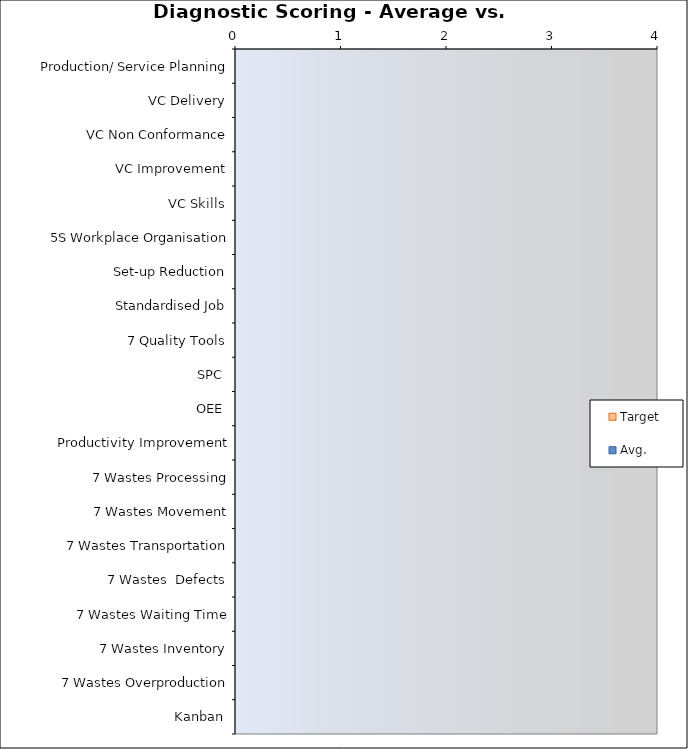
| Category | Target | Avg. |
|---|---|---|
| Production/ Service Planning | 0 | 0 |
| VC Delivery | 0 | 0 |
| VC Non Conformance | 0 | 0 |
| VC Improvement | 0 | 0 |
| VC Skills | 0 | 0 |
| 5S Workplace Organisation | 0 | 0 |
| Set-up Reduction | 0 | 0 |
| Standardised Job | 0 | 0 |
| 7 Quality Tools | 0 | 0 |
| SPC | 0 | 0 |
| OEE | 0 | 0 |
| Productivity Improvement | 0 | 0 |
| 7 Wastes Processing | 0 | 0 |
| 7 Wastes Movement | 0 | 0 |
| 7 Wastes Transportation | 0 | 0 |
| 7 Wastes  Defects | 0 | 0 |
| 7 Wastes Waiting Time | 0 | 0 |
| 7 Wastes Inventory | 0 | 0 |
| 7 Wastes Overproduction | 0 | 0 |
| Kanban | 0 | 0 |